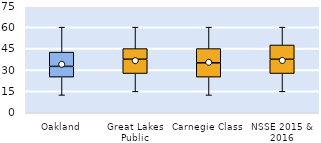
| Category | 25th | 50th | 75th |
|---|---|---|---|
| Oakland | 25 | 7.5 | 10 |
| Great Lakes Public | 27.5 | 10 | 7.5 |
| Carnegie Class | 25 | 10 | 10 |
| NSSE 2015 & 2016 | 27.5 | 10 | 10 |